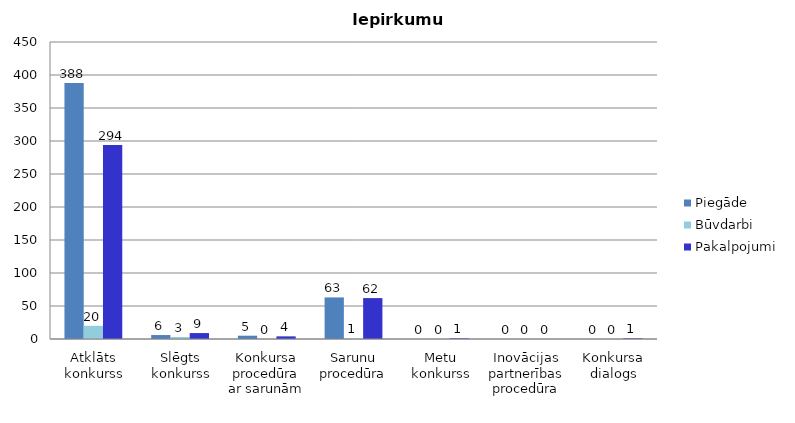
| Category | Piegāde | Būvdarbi | Pakalpojumi |
|---|---|---|---|
| Atklāts konkurss | 388 | 20 | 294 |
| Slēgts konkurss | 6 | 3 | 9 |
| Konkursa procedūra ar sarunām | 5 | 0 | 4 |
| Sarunu procedūra | 63 | 1 | 62 |
| Metu konkurss | 0 | 0 | 1 |
| Inovācijas partnerības procedūra | 0 | 0 | 0 |
| Konkursa dialogs | 0 | 0 | 1 |